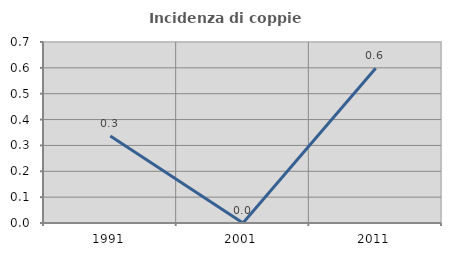
| Category | Incidenza di coppie miste |
|---|---|
| 1991.0 | 0.337 |
| 2001.0 | 0 |
| 2011.0 | 0.599 |